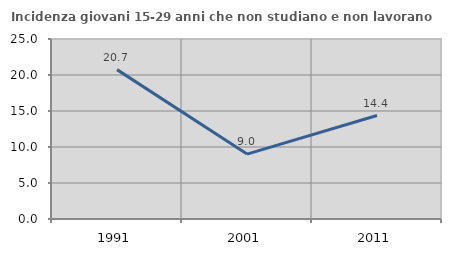
| Category | Incidenza giovani 15-29 anni che non studiano e non lavorano  |
|---|---|
| 1991.0 | 20.747 |
| 2001.0 | 9.012 |
| 2011.0 | 14.371 |